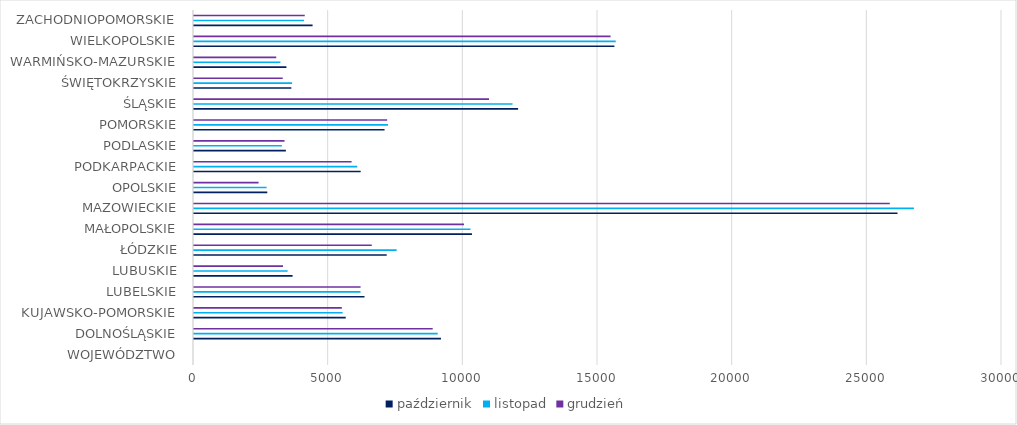
| Category | Series 0 | Series 1 | październik | Series 3 | Series 4 | listopad | Series 6 | Series 7 | grudzień | Series 9 | Series 10 |
|---|---|---|---|---|---|---|---|---|---|---|---|
| WOJEWÓDZTWO |  |  | 0 |  |  | 0 |  |  | 0 |  |  |
| DOLNOŚLĄSKIE |  |  | 9170 |  |  | 9048 |  |  | 8862 |  |  |
| KUJAWSKO-POMORSKIE |  |  | 5634 |  |  | 5518 |  |  | 5488 |  |  |
| LUBELSKIE |  |  | 6331 |  |  | 6183 |  |  | 6185 |  |  |
| LUBUSKIE |  |  | 3660 |  |  | 3476 |  |  | 3305 |  |  |
| ŁÓDZKIE |  |  | 7155 |  |  | 7524 |  |  | 6601 |  |  |
| MAŁOPOLSKIE |  |  | 10320 |  |  | 10266 |  |  | 10025 |  |  |
| MAZOWIECKIE |  |  | 26121 |  |  | 26729 |  |  | 25835 |  |  |
| OPOLSKIE |  |  | 2721 |  |  | 2696 |  |  | 2397 |  |  |
| PODKARPACKIE |  |  | 6189 |  |  | 6061 |  |  | 5851 |  |  |
| PODLASKIE |  |  | 3412 |  |  | 3263 |  |  | 3361 |  |  |
| POMORSKIE |  |  | 7075 |  |  | 7204 |  |  | 7171 |  |  |
| ŚLĄSKIE |  |  | 12033 |  |  | 11827 |  |  | 10953 |  |  |
| ŚWIĘTOKRZYSKIE |  |  | 3614 |  |  | 3642 |  |  | 3294 |  |  |
| WARMIŃSKO-MAZURSKIE |  |  | 3432 |  |  | 3208 |  |  | 3053 |  |  |
| WIELKOPOLSKIE |  |  | 15609 |  |  | 15659 |  |  | 15466 |  |  |
| ZACHODNIOPOMORSKIE |  |  | 4403 |  |  | 4085 |  |  | 4112 |  |  |